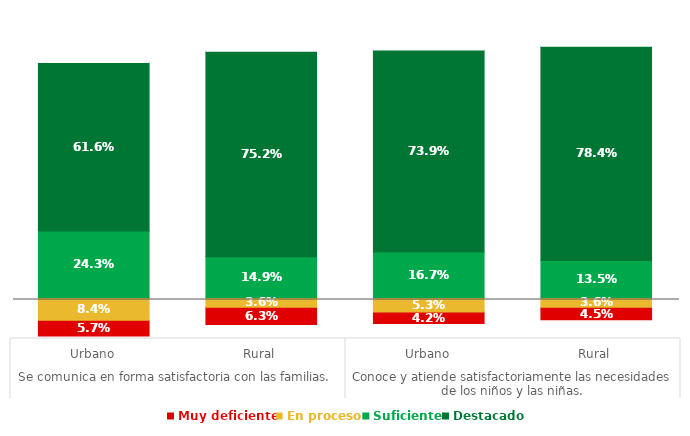
| Category | Series 0 | Muy deficiente | En proceso | Suficiente | Destacado | Series 5 |
|---|---|---|---|---|---|---|
| 0 | 0.009 | 0.057 | 0.084 | 0.243 | 0.616 | 0.141 |
| 1 | 0.051 | 0.063 | 0.036 | 0.149 | 0.752 | 0.099 |
| 2 | 0.055 | 0.042 | 0.053 | 0.167 | 0.739 | 0.095 |
| 3 | 0.069 | 0.045 | 0.036 | 0.135 | 0.784 | 0.081 |